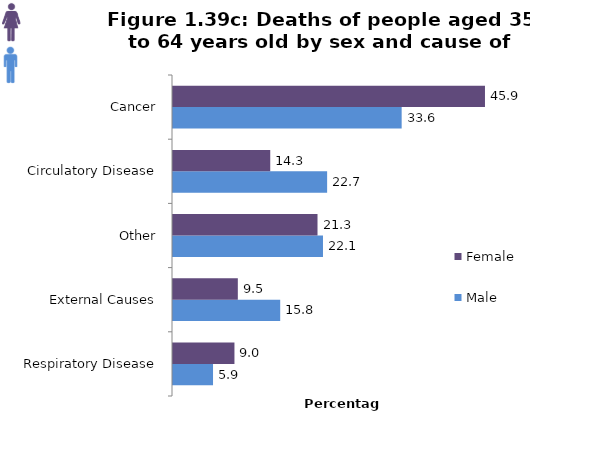
| Category | Male  | Female |
|---|---|---|
| Respiratory Disease | 5.886 | 9.037 |
| External Causes | 15.765 | 9.533 |
| Other | 22.057 | 21.251 |
| Circulatory Disease | 22.666 | 14.3 |
| Cancer | 33.627 | 45.879 |